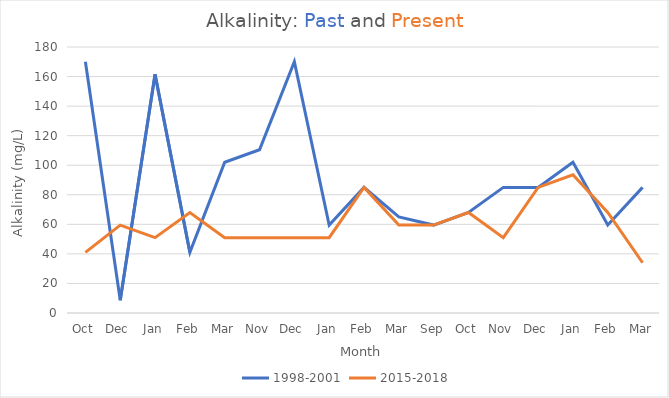
| Category | 1998-2001 | 2015-2018 |
|---|---|---|
| Oct | 170 | 41 |
| Dec | 8.6 | 59.5 |
| Jan | 161.5 | 51 |
| Feb | 41 | 68 |
| Mar | 102 | 51 |
| Nov | 110.5 | 51 |
| Dec | 170 | 51 |
| Jan | 59.5 | 51 |
| Feb | 85 | 85 |
| Mar | 65 | 59.5 |
| Sep | 59.5 | 59.5 |
| Oct | 68 | 68 |
| Nov | 85 | 51 |
| Dec | 85 | 85 |
| Jan | 102 | 93.5 |
| Feb | 59.5 | 68 |
| Mar | 85 | 34 |